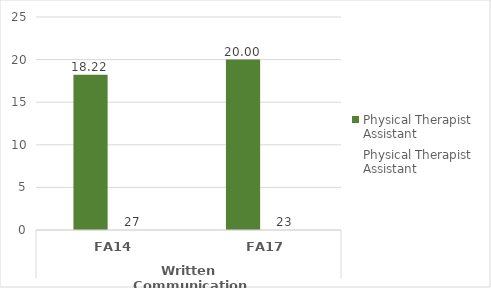
| Category | Average of outcome score - Physical Therapist Assistant | Count of outcome score - Physical Therapist Assistant |
|---|---|---|
| 0 | 18.222 | 27 |
| 1 | 20 | 23 |